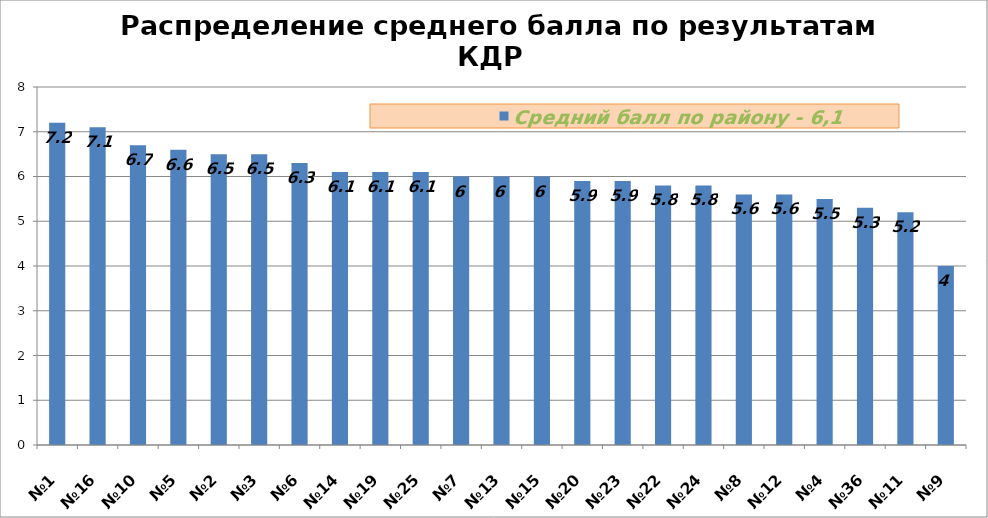
| Category | Средний балл по району - 6,1 |
|---|---|
| №1 | 7.2 |
| №16 | 7.1 |
| №10 | 6.7 |
| №5 | 6.6 |
| №2 | 6.5 |
| №3 | 6.5 |
| №6 | 6.3 |
| №14 | 6.1 |
| №19 | 6.1 |
| №25 | 6.1 |
| №7 | 6 |
| №13 | 6 |
| №15 | 6 |
| №20 | 5.9 |
| №23 | 5.9 |
| №22 | 5.8 |
| №24 | 5.8 |
| №8 | 5.6 |
| №12 | 5.6 |
| №4 | 5.5 |
| №36 | 5.3 |
| №11 | 5.2 |
| №9 | 4 |